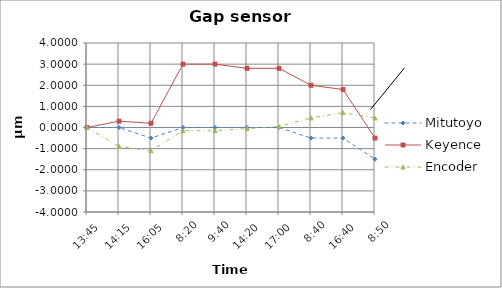
| Category | Mitutoyo | Keyence | Encoder |
|---|---|---|---|
| 0.5729166666666666 | 0 | 0 | 0 |
| 0.59375 | 0 | 0.3 | -0.9 |
| 0.6701388888888888 | -0.5 | 0.2 | -1.1 |
| 0.34722222222222227 | 0 | 3 | -0.15 |
| 0.40277777777777773 | 0 | 3 | -0.15 |
| 0.5972222222222222 | 0 | 2.8 | -0.05 |
| 0.7083333333333334 | 0 | 2.8 | 0.05 |
| 0.3611111111111111 | -0.5 | 2 | 0.45 |
| 0.6944444444444445 | -0.5 | 1.8 | 0.7 |
| 0.3680555555555556 | -1.5 | -0.5 | 0.45 |